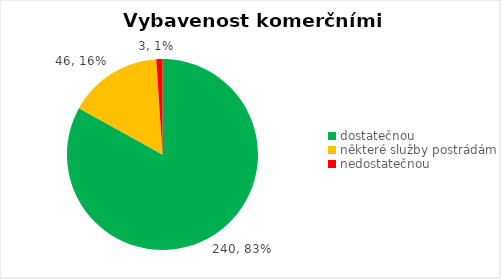
| Category |  účetní …. ) hodnotíte jako: |
|---|---|
| dostatečnou | 240 |
| některé služby postrádám | 46 |
| nedostatečnou | 3 |